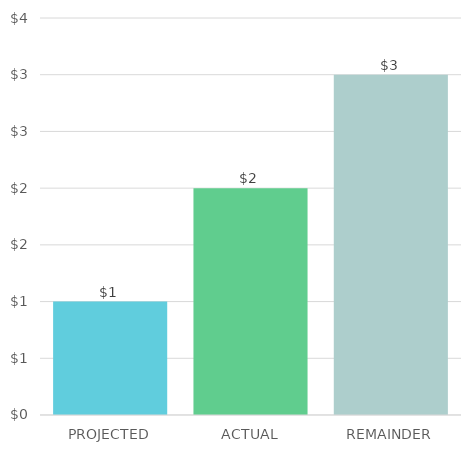
| Category | Series 0 |
|---|---|
| PROJECTED | 1 |
| ACTUAL | 2 |
| REMAINDER | 3 |